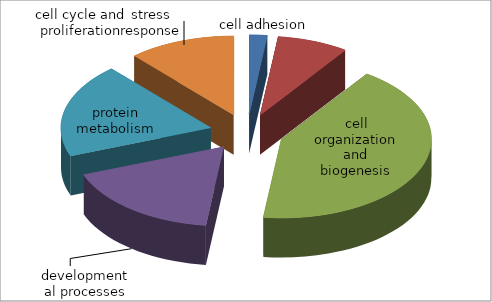
| Category | Series 0 |
|---|---|
| cell adhesion | 1 |
| cell cycle and proliferation | 4 |
| cell organization and biogenesis | 22 |
| developmental processes | 9 |
| protein metabolism | 10 |
| stress response | 6 |